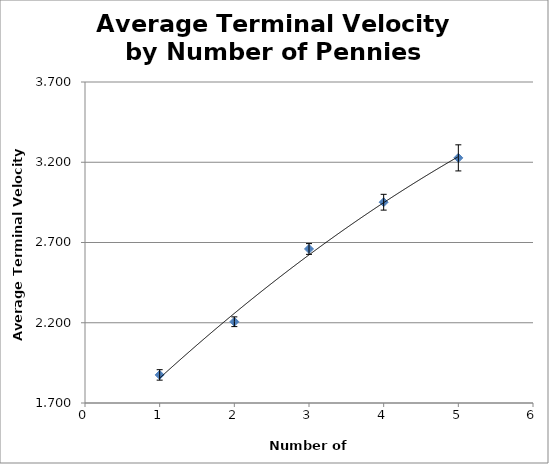
| Category | Series 0 |
|---|---|
| 1.0 | 1.875 |
| 2.0 | 2.206 |
| 3.0 | 2.66 |
| 4.0 | 2.951 |
| 5.0 | 3.227 |